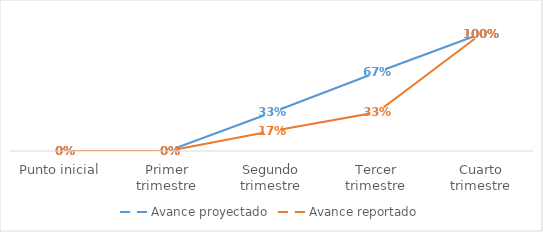
| Category | Avance proyectado | Avance reportado |
|---|---|---|
| Punto inicial | 0 | 0 |
| Primer trimestre | 0 | 0 |
| Segundo trimestre | 0.33 | 0.17 |
| Tercer trimestre | 0.67 | 0.33 |
| Cuarto trimestre | 1 | 1 |